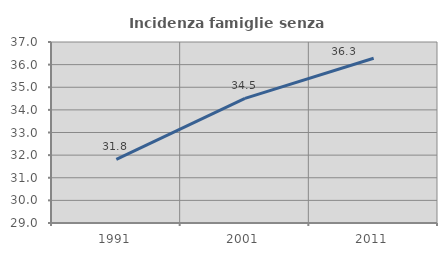
| Category | Incidenza famiglie senza nuclei |
|---|---|
| 1991.0 | 31.812 |
| 2001.0 | 34.511 |
| 2011.0 | 36.284 |